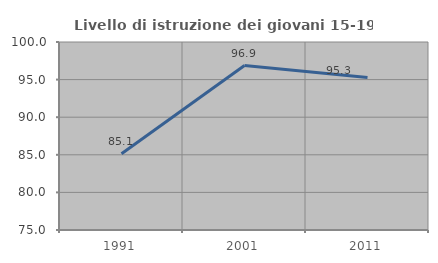
| Category | Livello di istruzione dei giovani 15-19 anni |
|---|---|
| 1991.0 | 85.143 |
| 2001.0 | 96.875 |
| 2011.0 | 95.266 |